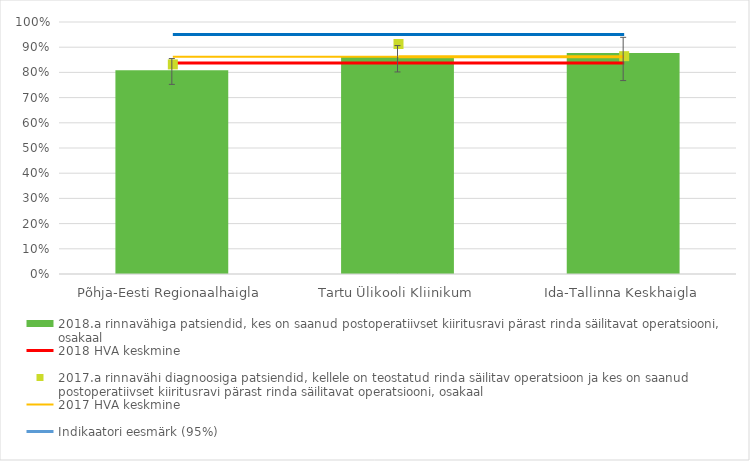
| Category | 2018.a rinnavähiga patsiendid, kes on saanud postoperatiivset kiiritusravi pärast rinda säilitavat operatsiooni, osakaal |
|---|---|
| Põhja-Eesti Regionaalhaigla | 0.809 |
| Tartu Ülikooli Kliinikum | 0.862 |
| Ida-Tallinna Keskhaigla | 0.877 |